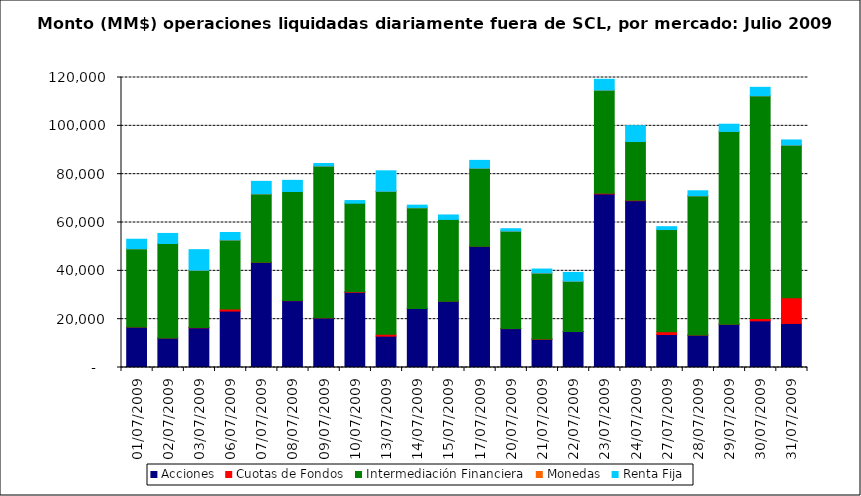
| Category | Acciones | Cuotas de Fondos | Intermediación Financiera | Monedas | Renta Fija |
|---|---|---|---|---|---|
| 01/07/2009 | 16742.376 | 9.999 | 32365.163 | 3.556 | 3948.335 |
| 02/07/2009 | 12213.308 | 33.55 | 39052.854 | 18.46 | 4151.305 |
| 03/07/2009 | 16415.297 | 170.998 | 23666.176 | 12.07 | 8499.699 |
| 06/07/2009 | 23349.852 | 854.565 | 28554.871 | 23.43 | 3068.372 |
| 07/07/2009 | 43461.757 | 92.393 | 28279.261 | 24.85 | 5169.044 |
| 08/07/2009 | 27649.574 | 25.57 | 45152.935 | 10.315 | 4600.831 |
| 09/07/2009 | 20506.02 | 53.474 | 62788.506 | 21.655 | 1036.487 |
| 10/07/2009 | 31105.975 | 199.984 | 36677.548 | 0 | 1096.081 |
| 13/07/2009 | 12971.699 | 750.275 | 59205.281 | 1.408 | 8456.337 |
| 14/07/2009 | 24408.434 | 10.154 | 41679.214 | 9.225 | 1074.433 |
| 15/07/2009 | 27440.91 | 14.737 | 33824.473 | 0 | 1845.033 |
| 17/07/2009 | 50174.663 | 15.216 | 32281.182 | 9.8 | 3226.207 |
| 20/07/2009 | 16086.28 | 15.049 | 40330.867 | 9.835 | 983.519 |
| 21/07/2009 | 11681.87 | 121.273 | 27257.814 | 47.6 | 1636.234 |
| 22/07/2009 | 14879.98 | 11.177 | 20803.315 | 19.25 | 3628.586 |
| 23/07/2009 | 71828.164 | 247.383 | 42692.124 | 17.5 | 4471.593 |
| 24/07/2009 | 69024.444 | 161.992 | 24311.885 | 14.7 | 6561.957 |
| 27/07/2009 | 13657.665 | 1140.123 | 42288.608 | 0.7 | 1181.946 |
| 28/07/2009 | 13399.225 | 48.412 | 57592.981 | 14.7 | 2070.994 |
| 29/07/2009 | 17888.909 | 34.514 | 79755.85 | 7.352 | 2980.673 |
| 30/07/2009 | 19299.233 | 939.739 | 92183.362 | 12.95 | 3507.376 |
| 31/07/2009 | 18227.566 | 10596.855 | 63194.926 | 24.514 | 2111.451 |